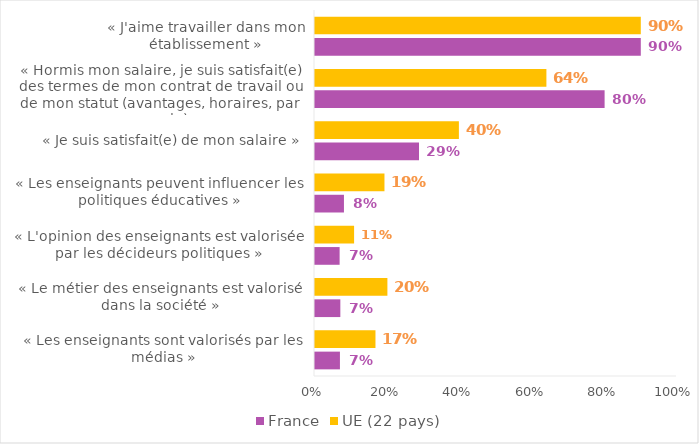
| Category | France | UE (22 pays) |
|---|---|---|
| « Les enseignants sont valorisés par les médias » | 0.069 | 0.167 |
| « Le métier des enseignants est valorisé dans la société » | 0.07 | 0.2 |
| « L'opinion des enseignants est valorisée par les décideurs politiques » | 0.068 | 0.108 |
| « Les enseignants peuvent influencer les politiques éducatives » | 0.08 | 0.192 |
| « Je suis satisfait(e) de mon salaire » | 0.287 | 0.397 |
| « Hormis mon salaire, je suis satisfait(e) des termes de mon contrat de travail ou de mon statut (avantages, horaires, par exemple) » | 0.8 | 0.639 |
| « J'aime travailler dans mon établissement » | 0.9 | 0.9 |